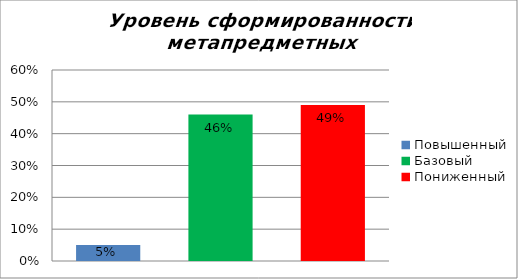
| Category | Уровень сформированности метапредметных результатов |
|---|---|
| Повышенный | 0.05 |
| Базовый | 0.46 |
| Пониженный | 0.49 |